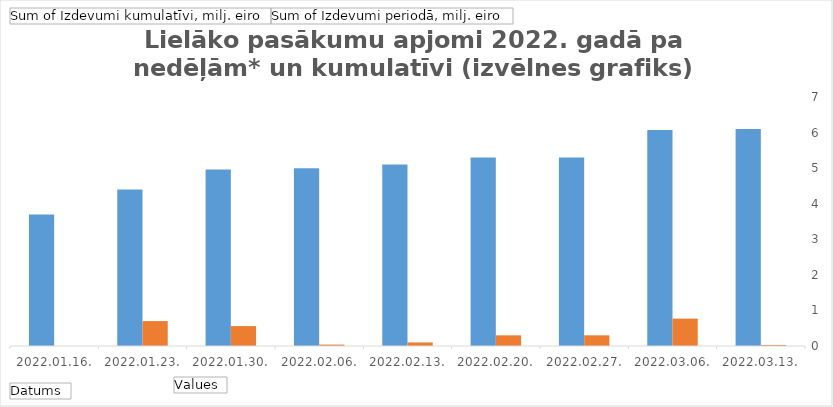
| Category | Sum of Izdevumi kumulatīvi, milj. eiro | Sum of Izdevumi periodā, milj. eiro |
|---|---|---|
| 2022.01.16. | 3.7 | 0 |
| 2022.01.23. | 4.4 | 0.7 |
| 2022.01.30. | 4.96 | 0.56 |
| 2022.02.06. | 5 | 0.04 |
| 2022.02.13. | 5.1 | 0.1 |
| 2022.02.20. | 5.3 | 0.3 |
| 2022.02.27. | 5.3 | 0.3 |
| 2022.03.06. | 6.07 | 0.77 |
| 2022.03.13. | 6.1 | 0.03 |